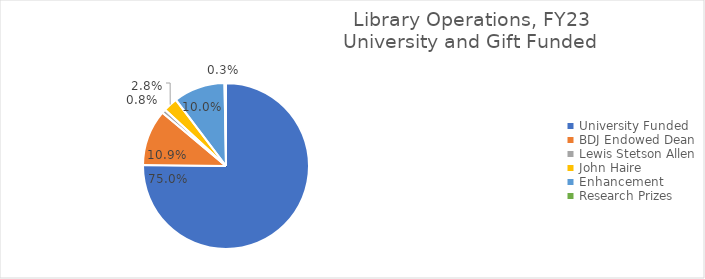
| Category | Series 0 |
|---|---|
| University Funded | 0.75 |
| BDJ Endowed Dean | 0.109 |
| Lewis Stetson Allen | 0.008 |
| John Haire  | 0.028 |
| Enhancement | 0.1 |
| Research Prizes | 0.003 |